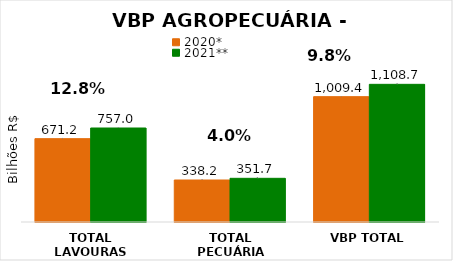
| Category | 2020* | 2021** |
|---|---|---|
| TOTAL LAVOURAS | 671.181 | 756.96 |
| TOTAL PECUÁRIA | 338.243 | 351.723 |
| VBP TOTAL | 1009.424 | 1108.682 |